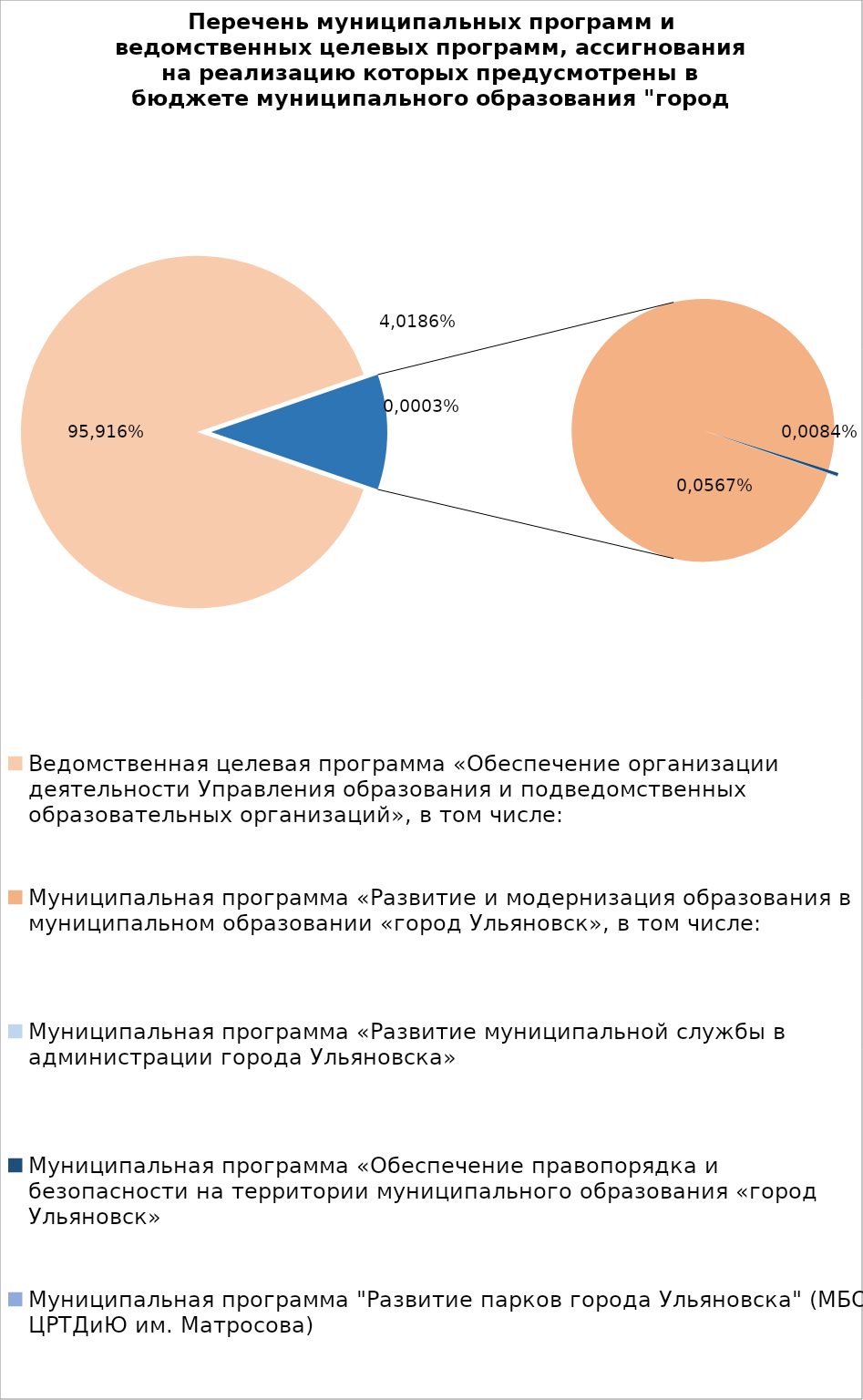
| Category | Series 0 |
|---|---|
| Ведомственная целевая программа «Обеспечение организации деятельности Управления образования и подведомственных образовательных организаций», в том числе: | 6115252.48 |
| Муниципальная программа «Развитие и модернизация образования в муниципальном образовании «город Ульяновск», в том числе: | 719422.32 |
| Муниципальная программа «Развитие муниципальной службы в администрации города Ульяновска» | 14.3 |
| Муниципальная программа «Обеспечение правопорядка и безопасности на территории муниципального образования «город Ульяновск» | 2700 |
| Муниципальная программа "Развитие парков города Ульяновска" (МБОУ ЦРТДиЮ им. Матросова) | 400 |